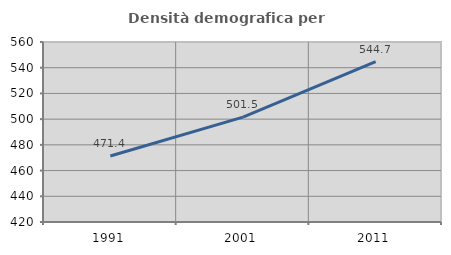
| Category | Densità demografica |
|---|---|
| 1991.0 | 471.362 |
| 2001.0 | 501.543 |
| 2011.0 | 544.695 |